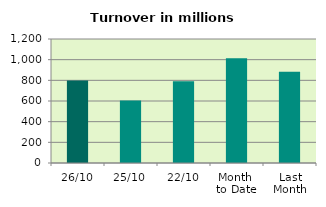
| Category | Series 0 |
|---|---|
| 26/10 | 798.079 |
| 25/10 | 604.282 |
| 22/10 | 790.426 |
| Month 
to Date | 1013.939 |
| Last
Month | 883.598 |